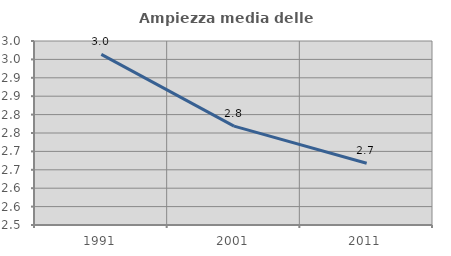
| Category | Ampiezza media delle famiglie |
|---|---|
| 1991.0 | 2.964 |
| 2001.0 | 2.769 |
| 2011.0 | 2.668 |